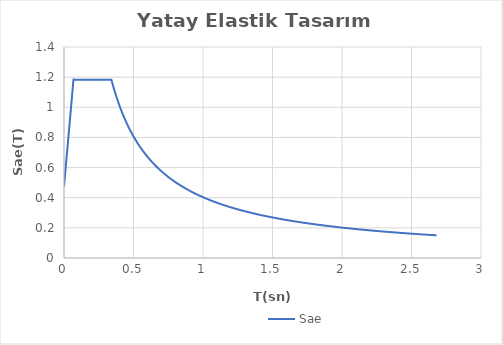
| Category | Sae |
|---|---|
| 0.0 | 0.473 |
| 0.004 | 0.515 |
| 0.008 | 0.557 |
| 0.012 | 0.598 |
| 0.016 | 0.64 |
| 0.02 | 0.681 |
| 0.024 | 0.723 |
| 0.028 | 0.765 |
| 0.032 | 0.806 |
| 0.036000000000000004 | 0.848 |
| 0.04000000000000001 | 0.89 |
| 0.04400000000000001 | 0.931 |
| 0.048000000000000015 | 0.973 |
| 0.05200000000000002 | 1.015 |
| 0.05600000000000002 | 1.056 |
| 0.060000000000000026 | 1.098 |
| 0.06400000000000003 | 1.139 |
| 0.06820486815415822 | 1.183 |
| 0.07200000000000004 | 1.183 |
| 0.07600000000000004 | 1.183 |
| 0.08000000000000004 | 1.183 |
| 0.08400000000000005 | 1.183 |
| 0.08800000000000005 | 1.183 |
| 0.09200000000000005 | 1.183 |
| 0.09600000000000006 | 1.183 |
| 0.10000000000000006 | 1.183 |
| 0.10400000000000006 | 1.183 |
| 0.10800000000000007 | 1.183 |
| 0.11200000000000007 | 1.183 |
| 0.11600000000000008 | 1.183 |
| 0.12000000000000008 | 1.183 |
| 0.12400000000000008 | 1.183 |
| 0.12800000000000009 | 1.183 |
| 0.1320000000000001 | 1.183 |
| 0.1360000000000001 | 1.183 |
| 0.1400000000000001 | 1.183 |
| 0.1440000000000001 | 1.183 |
| 0.1480000000000001 | 1.183 |
| 0.1520000000000001 | 1.183 |
| 0.1560000000000001 | 1.183 |
| 0.16000000000000011 | 1.183 |
| 0.16400000000000012 | 1.183 |
| 0.16800000000000012 | 1.183 |
| 0.17200000000000013 | 1.183 |
| 0.17600000000000013 | 1.183 |
| 0.18000000000000013 | 1.183 |
| 0.18400000000000014 | 1.183 |
| 0.18800000000000014 | 1.183 |
| 0.19200000000000014 | 1.183 |
| 0.19600000000000015 | 1.183 |
| 0.20000000000000015 | 1.183 |
| 0.20400000000000015 | 1.183 |
| 0.20800000000000016 | 1.183 |
| 0.21200000000000016 | 1.183 |
| 0.21600000000000016 | 1.183 |
| 0.22000000000000017 | 1.183 |
| 0.22400000000000017 | 1.183 |
| 0.22800000000000017 | 1.183 |
| 0.23200000000000018 | 1.183 |
| 0.23600000000000018 | 1.183 |
| 0.24000000000000019 | 1.183 |
| 0.2440000000000002 | 1.183 |
| 0.2480000000000002 | 1.183 |
| 0.25200000000000017 | 1.183 |
| 0.25600000000000017 | 1.183 |
| 0.2600000000000002 | 1.183 |
| 0.2640000000000002 | 1.183 |
| 0.2680000000000002 | 1.183 |
| 0.2720000000000002 | 1.183 |
| 0.2760000000000002 | 1.183 |
| 0.2800000000000002 | 1.183 |
| 0.2840000000000002 | 1.183 |
| 0.2880000000000002 | 1.183 |
| 0.2920000000000002 | 1.183 |
| 0.2960000000000002 | 1.183 |
| 0.3000000000000002 | 1.183 |
| 0.3040000000000002 | 1.183 |
| 0.3080000000000002 | 1.183 |
| 0.3120000000000002 | 1.183 |
| 0.3160000000000002 | 1.183 |
| 0.32000000000000023 | 1.183 |
| 0.32400000000000023 | 1.183 |
| 0.32800000000000024 | 1.183 |
| 0.33200000000000024 | 1.183 |
| 0.33600000000000024 | 1.183 |
| 0.3410243407707911 | 1.183 |
| 0.34400000000000025 | 1.173 |
| 0.34800000000000025 | 1.159 |
| 0.35200000000000026 | 1.146 |
| 0.35600000000000026 | 1.133 |
| 0.36000000000000026 | 1.121 |
| 0.36400000000000027 | 1.109 |
| 0.36800000000000027 | 1.096 |
| 0.3720000000000003 | 1.085 |
| 0.3760000000000003 | 1.073 |
| 0.3800000000000003 | 1.062 |
| 0.3840000000000003 | 1.051 |
| 0.3880000000000003 | 1.04 |
| 0.3920000000000003 | 1.029 |
| 0.3960000000000003 | 1.019 |
| 0.4000000000000003 | 1.009 |
| 0.4040000000000003 | 0.999 |
| 0.4080000000000003 | 0.989 |
| 0.4120000000000003 | 0.979 |
| 0.4160000000000003 | 0.97 |
| 0.4200000000000003 | 0.961 |
| 0.4240000000000003 | 0.952 |
| 0.4280000000000003 | 0.943 |
| 0.43200000000000033 | 0.934 |
| 0.43600000000000033 | 0.925 |
| 0.44000000000000034 | 0.917 |
| 0.44400000000000034 | 0.909 |
| 0.44800000000000034 | 0.901 |
| 0.45200000000000035 | 0.893 |
| 0.45600000000000035 | 0.885 |
| 0.46000000000000035 | 0.877 |
| 0.46400000000000036 | 0.87 |
| 0.46800000000000036 | 0.862 |
| 0.47200000000000036 | 0.855 |
| 0.47600000000000037 | 0.848 |
| 0.48000000000000037 | 0.841 |
| 0.4840000000000004 | 0.834 |
| 0.4880000000000004 | 0.827 |
| 0.4920000000000004 | 0.82 |
| 0.4960000000000004 | 0.814 |
| 0.5000000000000003 | 0.807 |
| 0.5040000000000003 | 0.801 |
| 0.5080000000000003 | 0.794 |
| 0.5120000000000003 | 0.788 |
| 0.5160000000000003 | 0.782 |
| 0.5200000000000004 | 0.776 |
| 0.5240000000000004 | 0.77 |
| 0.5280000000000004 | 0.764 |
| 0.5320000000000004 | 0.758 |
| 0.5360000000000004 | 0.753 |
| 0.5400000000000004 | 0.747 |
| 0.5440000000000004 | 0.742 |
| 0.5480000000000004 | 0.736 |
| 0.5520000000000004 | 0.731 |
| 0.5560000000000004 | 0.726 |
| 0.5600000000000004 | 0.721 |
| 0.5640000000000004 | 0.715 |
| 0.5680000000000004 | 0.71 |
| 0.5720000000000004 | 0.705 |
| 0.5760000000000004 | 0.701 |
| 0.5800000000000004 | 0.696 |
| 0.5840000000000004 | 0.691 |
| 0.5880000000000004 | 0.686 |
| 0.5920000000000004 | 0.682 |
| 0.5960000000000004 | 0.677 |
| 0.6000000000000004 | 0.672 |
| 0.6040000000000004 | 0.668 |
| 0.6080000000000004 | 0.664 |
| 0.6120000000000004 | 0.659 |
| 0.6160000000000004 | 0.655 |
| 0.6200000000000004 | 0.651 |
| 0.6240000000000004 | 0.647 |
| 0.6280000000000004 | 0.643 |
| 0.6320000000000005 | 0.638 |
| 0.6360000000000005 | 0.634 |
| 0.6400000000000005 | 0.63 |
| 0.6440000000000005 | 0.627 |
| 0.6480000000000005 | 0.623 |
| 0.6520000000000005 | 0.619 |
| 0.6560000000000005 | 0.615 |
| 0.6600000000000005 | 0.611 |
| 0.6640000000000005 | 0.608 |
| 0.6680000000000005 | 0.604 |
| 0.6720000000000005 | 0.6 |
| 0.6760000000000005 | 0.597 |
| 0.6800000000000005 | 0.593 |
| 0.6840000000000005 | 0.59 |
| 0.6880000000000005 | 0.586 |
| 0.6920000000000005 | 0.583 |
| 0.6960000000000005 | 0.58 |
| 0.7000000000000005 | 0.576 |
| 0.7040000000000005 | 0.573 |
| 0.7080000000000005 | 0.57 |
| 0.7120000000000005 | 0.567 |
| 0.7160000000000005 | 0.564 |
| 0.7200000000000005 | 0.56 |
| 0.7240000000000005 | 0.557 |
| 0.7280000000000005 | 0.554 |
| 0.7320000000000005 | 0.551 |
| 0.7360000000000005 | 0.548 |
| 0.7400000000000005 | 0.545 |
| 0.7440000000000005 | 0.542 |
| 0.7480000000000006 | 0.539 |
| 0.7520000000000006 | 0.537 |
| 0.7560000000000006 | 0.534 |
| 0.7600000000000006 | 0.531 |
| 0.7640000000000006 | 0.528 |
| 0.7680000000000006 | 0.525 |
| 0.7720000000000006 | 0.523 |
| 0.7760000000000006 | 0.52 |
| 0.7800000000000006 | 0.517 |
| 0.7840000000000006 | 0.515 |
| 0.7880000000000006 | 0.512 |
| 0.7920000000000006 | 0.509 |
| 0.7960000000000006 | 0.507 |
| 0.8000000000000006 | 0.504 |
| 0.8040000000000006 | 0.502 |
| 0.8080000000000006 | 0.499 |
| 0.8120000000000006 | 0.497 |
| 0.8160000000000006 | 0.494 |
| 0.8200000000000006 | 0.492 |
| 0.8240000000000006 | 0.49 |
| 0.8280000000000006 | 0.487 |
| 0.8320000000000006 | 0.485 |
| 0.8360000000000006 | 0.483 |
| 0.8400000000000006 | 0.48 |
| 0.8440000000000006 | 0.478 |
| 0.8480000000000006 | 0.476 |
| 0.8520000000000006 | 0.474 |
| 0.8560000000000006 | 0.471 |
| 0.8600000000000007 | 0.469 |
| 0.8640000000000007 | 0.467 |
| 0.8680000000000007 | 0.465 |
| 0.8720000000000007 | 0.463 |
| 0.8760000000000007 | 0.461 |
| 0.8800000000000007 | 0.459 |
| 0.8840000000000007 | 0.456 |
| 0.8880000000000007 | 0.454 |
| 0.8920000000000007 | 0.452 |
| 0.8960000000000007 | 0.45 |
| 0.9000000000000007 | 0.448 |
| 0.9040000000000007 | 0.446 |
| 0.9080000000000007 | 0.444 |
| 0.9120000000000007 | 0.442 |
| 0.9160000000000007 | 0.441 |
| 0.9200000000000007 | 0.439 |
| 0.9240000000000007 | 0.437 |
| 0.9280000000000007 | 0.435 |
| 0.9320000000000007 | 0.433 |
| 0.9360000000000007 | 0.431 |
| 0.9400000000000007 | 0.429 |
| 0.9440000000000007 | 0.427 |
| 0.9480000000000007 | 0.426 |
| 0.9520000000000007 | 0.424 |
| 0.9560000000000007 | 0.422 |
| 0.9600000000000007 | 0.42 |
| 0.9640000000000007 | 0.419 |
| 0.9680000000000007 | 0.417 |
| 0.9720000000000008 | 0.415 |
| 0.9760000000000008 | 0.413 |
| 0.9800000000000008 | 0.412 |
| 0.9840000000000008 | 0.41 |
| 0.9880000000000008 | 0.408 |
| 0.9920000000000008 | 0.407 |
| 0.9960000000000008 | 0.405 |
| 1.0 | 0.404 |
| 1.0040000000000007 | 0.402 |
| 1.0080000000000007 | 0.4 |
| 1.0120000000000007 | 0.399 |
| 1.0160000000000007 | 0.397 |
| 1.0200000000000007 | 0.396 |
| 1.0240000000000007 | 0.394 |
| 1.0280000000000007 | 0.393 |
| 1.0320000000000007 | 0.391 |
| 1.0360000000000007 | 0.389 |
| 1.0400000000000007 | 0.388 |
| 1.0440000000000007 | 0.386 |
| 1.0480000000000007 | 0.385 |
| 1.0520000000000007 | 0.384 |
| 1.0560000000000007 | 0.382 |
| 1.0600000000000007 | 0.381 |
| 1.0640000000000007 | 0.379 |
| 1.0680000000000007 | 0.378 |
| 1.0720000000000007 | 0.376 |
| 1.0760000000000007 | 0.375 |
| 1.0800000000000007 | 0.374 |
| 1.0840000000000007 | 0.372 |
| 1.0880000000000007 | 0.371 |
| 1.0920000000000007 | 0.37 |
| 1.0960000000000008 | 0.368 |
| 1.1000000000000008 | 0.367 |
| 1.1040000000000008 | 0.365 |
| 1.1080000000000008 | 0.364 |
| 1.1120000000000008 | 0.363 |
| 1.1160000000000008 | 0.362 |
| 1.1200000000000008 | 0.36 |
| 1.1240000000000008 | 0.359 |
| 1.1280000000000008 | 0.358 |
| 1.1320000000000008 | 0.356 |
| 1.1360000000000008 | 0.355 |
| 1.1400000000000008 | 0.354 |
| 1.1440000000000008 | 0.353 |
| 1.1480000000000008 | 0.351 |
| 1.1520000000000008 | 0.35 |
| 1.1560000000000008 | 0.349 |
| 1.1600000000000008 | 0.348 |
| 1.1640000000000008 | 0.347 |
| 1.1680000000000008 | 0.345 |
| 1.1720000000000008 | 0.344 |
| 1.1760000000000008 | 0.343 |
| 1.1800000000000008 | 0.342 |
| 1.1840000000000008 | 0.341 |
| 1.1880000000000008 | 0.34 |
| 1.1920000000000008 | 0.339 |
| 1.1960000000000008 | 0.337 |
| 1.2000000000000008 | 0.336 |
| 1.2040000000000008 | 0.335 |
| 1.2080000000000009 | 0.334 |
| 1.2120000000000009 | 0.333 |
| 1.2160000000000009 | 0.332 |
| 1.2200000000000009 | 0.331 |
| 1.2240000000000009 | 0.33 |
| 1.2280000000000009 | 0.329 |
| 1.2320000000000009 | 0.328 |
| 1.2360000000000009 | 0.326 |
| 1.2400000000000009 | 0.325 |
| 1.2440000000000009 | 0.324 |
| 1.2480000000000009 | 0.323 |
| 1.252000000000001 | 0.322 |
| 1.256000000000001 | 0.321 |
| 1.260000000000001 | 0.32 |
| 1.264000000000001 | 0.319 |
| 1.268000000000001 | 0.318 |
| 1.272000000000001 | 0.317 |
| 1.276000000000001 | 0.316 |
| 1.280000000000001 | 0.315 |
| 1.284000000000001 | 0.314 |
| 1.288000000000001 | 0.313 |
| 1.292000000000001 | 0.312 |
| 1.296000000000001 | 0.311 |
| 1.300000000000001 | 0.31 |
| 1.304000000000001 | 0.309 |
| 1.308000000000001 | 0.308 |
| 1.312000000000001 | 0.308 |
| 1.316000000000001 | 0.307 |
| 1.320000000000001 | 0.306 |
| 1.324000000000001 | 0.305 |
| 1.328000000000001 | 0.304 |
| 1.332000000000001 | 0.303 |
| 1.336000000000001 | 0.302 |
| 1.340000000000001 | 0.301 |
| 1.344000000000001 | 0.3 |
| 1.348000000000001 | 0.299 |
| 1.352000000000001 | 0.298 |
| 1.356000000000001 | 0.298 |
| 1.360000000000001 | 0.297 |
| 1.364000000000001 | 0.296 |
| 1.368000000000001 | 0.295 |
| 1.372000000000001 | 0.294 |
| 1.376000000000001 | 0.293 |
| 1.380000000000001 | 0.292 |
| 1.384000000000001 | 0.292 |
| 1.388000000000001 | 0.291 |
| 1.392000000000001 | 0.29 |
| 1.396000000000001 | 0.289 |
| 1.400000000000001 | 0.288 |
| 1.404000000000001 | 0.287 |
| 1.408000000000001 | 0.287 |
| 1.412000000000001 | 0.286 |
| 1.416000000000001 | 0.285 |
| 1.420000000000001 | 0.284 |
| 1.424000000000001 | 0.283 |
| 1.428000000000001 | 0.283 |
| 1.432000000000001 | 0.282 |
| 1.436000000000001 | 0.281 |
| 1.440000000000001 | 0.28 |
| 1.444000000000001 | 0.279 |
| 1.448000000000001 | 0.279 |
| 1.452000000000001 | 0.278 |
| 1.456000000000001 | 0.277 |
| 1.460000000000001 | 0.276 |
| 1.464000000000001 | 0.276 |
| 1.468000000000001 | 0.275 |
| 1.472000000000001 | 0.274 |
| 1.476000000000001 | 0.273 |
| 1.480000000000001 | 0.273 |
| 1.484000000000001 | 0.272 |
| 1.488000000000001 | 0.271 |
| 1.492000000000001 | 0.27 |
| 1.496000000000001 | 0.27 |
| 1.500000000000001 | 0.269 |
| 1.5040000000000011 | 0.268 |
| 1.5080000000000011 | 0.268 |
| 1.5120000000000011 | 0.267 |
| 1.5160000000000011 | 0.266 |
| 1.5200000000000011 | 0.265 |
| 1.5240000000000011 | 0.265 |
| 1.5280000000000011 | 0.264 |
| 1.5320000000000011 | 0.263 |
| 1.5360000000000011 | 0.263 |
| 1.5400000000000011 | 0.262 |
| 1.5440000000000011 | 0.261 |
| 1.5480000000000012 | 0.261 |
| 1.5520000000000012 | 0.26 |
| 1.5560000000000012 | 0.259 |
| 1.5600000000000012 | 0.259 |
| 1.5640000000000012 | 0.258 |
| 1.5680000000000012 | 0.257 |
| 1.5720000000000012 | 0.257 |
| 1.5760000000000012 | 0.256 |
| 1.5800000000000012 | 0.255 |
| 1.5840000000000012 | 0.255 |
| 1.5880000000000012 | 0.254 |
| 1.5920000000000012 | 0.253 |
| 1.5960000000000012 | 0.253 |
| 1.6000000000000012 | 0.252 |
| 1.6040000000000012 | 0.252 |
| 1.6080000000000012 | 0.251 |
| 1.6120000000000012 | 0.25 |
| 1.6160000000000012 | 0.25 |
| 1.6200000000000012 | 0.249 |
| 1.6240000000000012 | 0.248 |
| 1.6280000000000012 | 0.248 |
| 1.6320000000000012 | 0.247 |
| 1.6360000000000012 | 0.247 |
| 1.6400000000000012 | 0.246 |
| 1.6440000000000012 | 0.245 |
| 1.6480000000000012 | 0.245 |
| 1.6520000000000012 | 0.244 |
| 1.6560000000000012 | 0.244 |
| 1.6600000000000013 | 0.243 |
| 1.6640000000000013 | 0.242 |
| 1.6680000000000013 | 0.242 |
| 1.6720000000000013 | 0.241 |
| 1.6760000000000013 | 0.241 |
| 1.6800000000000013 | 0.24 |
| 1.6840000000000013 | 0.24 |
| 1.6880000000000013 | 0.239 |
| 1.6920000000000013 | 0.238 |
| 1.6960000000000013 | 0.238 |
| 1.7000000000000013 | 0.237 |
| 1.7040000000000013 | 0.237 |
| 1.7080000000000013 | 0.236 |
| 1.7120000000000013 | 0.236 |
| 1.7160000000000013 | 0.235 |
| 1.7200000000000013 | 0.235 |
| 1.7240000000000013 | 0.234 |
| 1.7280000000000013 | 0.234 |
| 1.7320000000000013 | 0.233 |
| 1.7360000000000013 | 0.232 |
| 1.7400000000000013 | 0.232 |
| 1.7440000000000013 | 0.231 |
| 1.7480000000000013 | 0.231 |
| 1.7520000000000013 | 0.23 |
| 1.7560000000000013 | 0.23 |
| 1.7600000000000013 | 0.229 |
| 1.7640000000000013 | 0.229 |
| 1.7680000000000013 | 0.228 |
| 1.7720000000000014 | 0.228 |
| 1.7760000000000014 | 0.227 |
| 1.7800000000000014 | 0.227 |
| 1.7840000000000014 | 0.226 |
| 1.7880000000000014 | 0.226 |
| 1.7920000000000014 | 0.225 |
| 1.7960000000000014 | 0.225 |
| 1.8000000000000014 | 0.224 |
| 1.8040000000000014 | 0.224 |
| 1.8080000000000014 | 0.223 |
| 1.8120000000000014 | 0.223 |
| 1.8160000000000014 | 0.222 |
| 1.8200000000000014 | 0.222 |
| 1.8240000000000014 | 0.221 |
| 1.8280000000000014 | 0.221 |
| 1.8320000000000014 | 0.22 |
| 1.8360000000000014 | 0.22 |
| 1.8400000000000014 | 0.219 |
| 1.8440000000000014 | 0.219 |
| 1.8480000000000014 | 0.218 |
| 1.8520000000000014 | 0.218 |
| 1.8560000000000014 | 0.217 |
| 1.8600000000000014 | 0.217 |
| 1.8640000000000014 | 0.216 |
| 1.8680000000000014 | 0.216 |
| 1.8720000000000014 | 0.216 |
| 1.8760000000000014 | 0.215 |
| 1.8800000000000014 | 0.215 |
| 1.8840000000000015 | 0.214 |
| 1.8880000000000015 | 0.214 |
| 1.8920000000000015 | 0.213 |
| 1.8960000000000015 | 0.213 |
| 1.9000000000000015 | 0.212 |
| 1.9040000000000015 | 0.212 |
| 1.9080000000000015 | 0.211 |
| 1.9120000000000015 | 0.211 |
| 1.9160000000000015 | 0.211 |
| 1.9200000000000015 | 0.21 |
| 1.9240000000000015 | 0.21 |
| 1.9280000000000015 | 0.209 |
| 1.9320000000000015 | 0.209 |
| 1.9360000000000015 | 0.208 |
| 1.9400000000000015 | 0.208 |
| 1.9440000000000015 | 0.208 |
| 1.9480000000000015 | 0.207 |
| 1.9520000000000015 | 0.207 |
| 1.9560000000000015 | 0.206 |
| 1.9600000000000015 | 0.206 |
| 1.9640000000000015 | 0.205 |
| 1.9680000000000015 | 0.205 |
| 1.9720000000000015 | 0.205 |
| 1.9760000000000015 | 0.204 |
| 1.9800000000000015 | 0.204 |
| 1.9840000000000015 | 0.203 |
| 1.9880000000000015 | 0.203 |
| 1.9920000000000015 | 0.203 |
| 1.9960000000000016 | 0.202 |
| 2.0000000000000013 | 0.202 |
| 2.0040000000000013 | 0.201 |
| 2.0080000000000013 | 0.201 |
| 2.0120000000000013 | 0.201 |
| 2.0160000000000013 | 0.2 |
| 2.0200000000000014 | 0.2 |
| 2.0240000000000014 | 0.199 |
| 2.0280000000000014 | 0.199 |
| 2.0320000000000014 | 0.199 |
| 2.0360000000000014 | 0.198 |
| 2.0400000000000014 | 0.198 |
| 2.0440000000000014 | 0.197 |
| 2.0480000000000014 | 0.197 |
| 2.0520000000000014 | 0.197 |
| 2.0560000000000014 | 0.196 |
| 2.0600000000000014 | 0.196 |
| 2.0640000000000014 | 0.195 |
| 2.0680000000000014 | 0.195 |
| 2.0720000000000014 | 0.195 |
| 2.0760000000000014 | 0.194 |
| 2.0800000000000014 | 0.194 |
| 2.0840000000000014 | 0.194 |
| 2.0880000000000014 | 0.193 |
| 2.0920000000000014 | 0.193 |
| 2.0960000000000014 | 0.193 |
| 2.1000000000000014 | 0.192 |
| 2.1040000000000014 | 0.192 |
| 2.1080000000000014 | 0.191 |
| 2.1120000000000014 | 0.191 |
| 2.1160000000000014 | 0.191 |
| 2.1200000000000014 | 0.19 |
| 2.1240000000000014 | 0.19 |
| 2.1280000000000014 | 0.19 |
| 2.1320000000000014 | 0.189 |
| 2.1360000000000015 | 0.189 |
| 2.1400000000000015 | 0.189 |
| 2.1440000000000015 | 0.188 |
| 2.1480000000000015 | 0.188 |
| 2.1520000000000015 | 0.187 |
| 2.1560000000000015 | 0.187 |
| 2.1600000000000015 | 0.187 |
| 2.1640000000000015 | 0.186 |
| 2.1680000000000015 | 0.186 |
| 2.1720000000000015 | 0.186 |
| 2.1760000000000015 | 0.185 |
| 2.1800000000000015 | 0.185 |
| 2.1840000000000015 | 0.185 |
| 2.1880000000000015 | 0.184 |
| 2.1920000000000015 | 0.184 |
| 2.1960000000000015 | 0.184 |
| 2.2000000000000015 | 0.183 |
| 2.2040000000000015 | 0.183 |
| 2.2080000000000015 | 0.183 |
| 2.2120000000000015 | 0.182 |
| 2.2160000000000015 | 0.182 |
| 2.2200000000000015 | 0.182 |
| 2.2240000000000015 | 0.181 |
| 2.2280000000000015 | 0.181 |
| 2.2320000000000015 | 0.181 |
| 2.2360000000000015 | 0.18 |
| 2.2400000000000015 | 0.18 |
| 2.2440000000000015 | 0.18 |
| 2.2480000000000016 | 0.179 |
| 2.2520000000000016 | 0.179 |
| 2.2560000000000016 | 0.179 |
| 2.2600000000000016 | 0.179 |
| 2.2640000000000016 | 0.178 |
| 2.2680000000000016 | 0.178 |
| 2.2720000000000016 | 0.178 |
| 2.2760000000000016 | 0.177 |
| 2.2800000000000016 | 0.177 |
| 2.2840000000000016 | 0.177 |
| 2.2880000000000016 | 0.176 |
| 2.2920000000000016 | 0.176 |
| 2.2960000000000016 | 0.176 |
| 2.3000000000000016 | 0.175 |
| 2.3040000000000016 | 0.175 |
| 2.3080000000000016 | 0.175 |
| 2.3120000000000016 | 0.175 |
| 2.3160000000000016 | 0.174 |
| 2.3200000000000016 | 0.174 |
| 2.3240000000000016 | 0.174 |
| 2.3280000000000016 | 0.173 |
| 2.3320000000000016 | 0.173 |
| 2.3360000000000016 | 0.173 |
| 2.3400000000000016 | 0.172 |
| 2.3440000000000016 | 0.172 |
| 2.3480000000000016 | 0.172 |
| 2.3520000000000016 | 0.172 |
| 2.3560000000000016 | 0.171 |
| 2.3600000000000017 | 0.171 |
| 2.3640000000000017 | 0.171 |
| 2.3680000000000017 | 0.17 |
| 2.3720000000000017 | 0.17 |
| 2.3760000000000017 | 0.17 |
| 2.3800000000000017 | 0.17 |
| 2.3840000000000017 | 0.169 |
| 2.3880000000000017 | 0.169 |
| 2.3920000000000017 | 0.169 |
| 2.3960000000000017 | 0.168 |
| 2.4000000000000017 | 0.168 |
| 2.4040000000000017 | 0.168 |
| 2.4080000000000017 | 0.168 |
| 2.4120000000000017 | 0.167 |
| 2.4160000000000017 | 0.167 |
| 2.4200000000000017 | 0.167 |
| 2.4240000000000017 | 0.166 |
| 2.4280000000000017 | 0.166 |
| 2.4320000000000017 | 0.166 |
| 2.4360000000000017 | 0.166 |
| 2.4400000000000017 | 0.165 |
| 2.4440000000000017 | 0.165 |
| 2.4480000000000017 | 0.165 |
| 2.4520000000000017 | 0.165 |
| 2.4560000000000017 | 0.164 |
| 2.4600000000000017 | 0.164 |
| 2.4640000000000017 | 0.164 |
| 2.4680000000000017 | 0.163 |
| 2.4720000000000018 | 0.163 |
| 2.4760000000000018 | 0.163 |
| 2.4800000000000018 | 0.163 |
| 2.4840000000000018 | 0.162 |
| 2.4880000000000018 | 0.162 |
| 2.4920000000000018 | 0.162 |
| 2.4960000000000018 | 0.162 |
| 2.5000000000000018 | 0.161 |
| 2.504000000000002 | 0.161 |
| 2.508000000000002 | 0.161 |
| 2.512000000000002 | 0.161 |
| 2.516000000000002 | 0.16 |
| 2.520000000000002 | 0.16 |
| 2.524000000000002 | 0.16 |
| 2.528000000000002 | 0.16 |
| 2.532000000000002 | 0.159 |
| 2.536000000000002 | 0.159 |
| 2.540000000000002 | 0.159 |
| 2.544000000000002 | 0.159 |
| 2.548000000000002 | 0.158 |
| 2.552000000000002 | 0.158 |
| 2.556000000000002 | 0.158 |
| 2.560000000000002 | 0.158 |
| 2.564000000000002 | 0.157 |
| 2.568000000000002 | 0.157 |
| 2.572000000000002 | 0.157 |
| 2.576000000000002 | 0.157 |
| 2.580000000000002 | 0.156 |
| 2.584000000000002 | 0.156 |
| 2.588000000000002 | 0.156 |
| 2.592000000000002 | 0.156 |
| 2.596000000000002 | 0.155 |
| 2.600000000000002 | 0.155 |
| 2.604000000000002 | 0.155 |
| 2.608000000000002 | 0.155 |
| 2.612000000000002 | 0.154 |
| 2.616000000000002 | 0.154 |
| 2.620000000000002 | 0.154 |
| 2.624000000000002 | 0.154 |
| 2.628000000000002 | 0.154 |
| 2.632000000000002 | 0.153 |
| 2.636000000000002 | 0.153 |
| 2.640000000000002 | 0.153 |
| 2.644000000000002 | 0.153 |
| 2.648000000000002 | 0.152 |
| 2.652000000000002 | 0.152 |
| 2.656000000000002 | 0.152 |
| 2.660000000000002 | 0.152 |
| 2.664000000000002 | 0.151 |
| 2.668000000000002 | 0.151 |
| 2.672000000000002 | 0.151 |
| 2.676000000000002 | 0.151 |
| 2.680000000000002 | 0.151 |